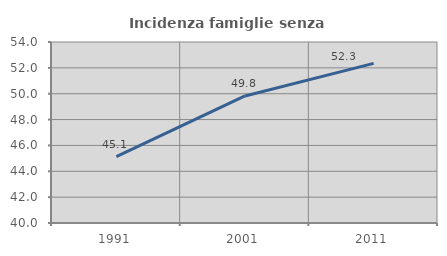
| Category | Incidenza famiglie senza nuclei |
|---|---|
| 1991.0 | 45.126 |
| 2001.0 | 49.828 |
| 2011.0 | 52.349 |